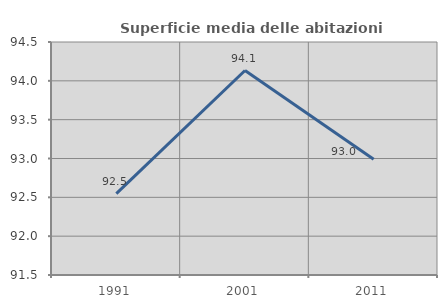
| Category | Superficie media delle abitazioni occupate |
|---|---|
| 1991.0 | 92.547 |
| 2001.0 | 94.133 |
| 2011.0 | 92.991 |